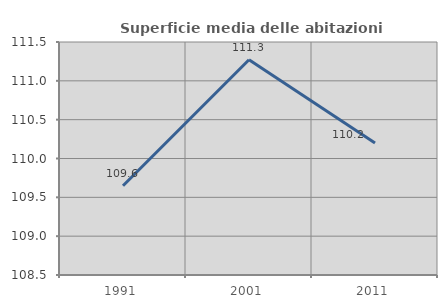
| Category | Superficie media delle abitazioni occupate |
|---|---|
| 1991.0 | 109.65 |
| 2001.0 | 111.272 |
| 2011.0 | 110.201 |